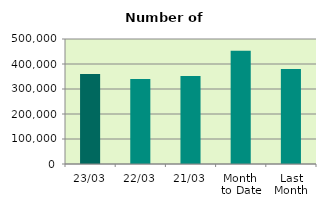
| Category | Series 0 |
|---|---|
| 23/03 | 359882 |
| 22/03 | 339686 |
| 21/03 | 351556 |
| Month 
to Date | 453250.941 |
| Last
Month | 380345.4 |